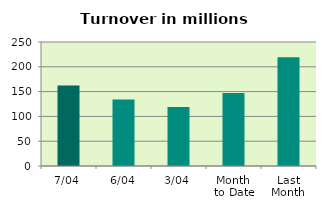
| Category | Series 0 |
|---|---|
| 7/04 | 162.142 |
| 6/04 | 134.272 |
| 3/04 | 118.761 |
| Month 
to Date | 147.328 |
| Last
Month | 219.362 |